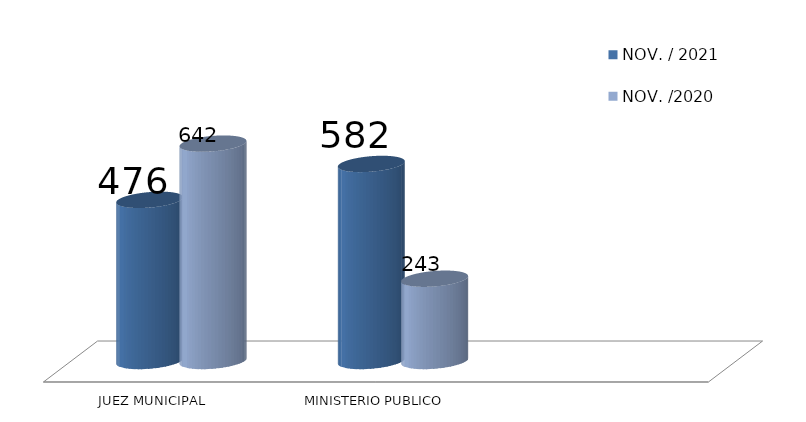
| Category | NOV. / 2021 | NOV. /2020 |
|---|---|---|
| JUEZ MUNICIPAL | 476 | 642 |
| MINISTERIO PUBLICO | 582 | 243 |